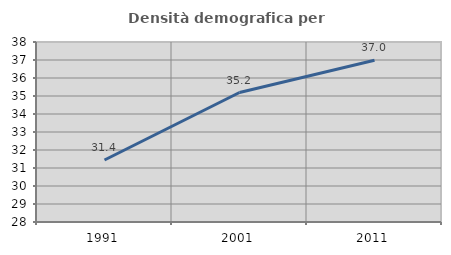
| Category | Densità demografica |
|---|---|
| 1991.0 | 31.446 |
| 2001.0 | 35.193 |
| 2011.0 | 36.986 |